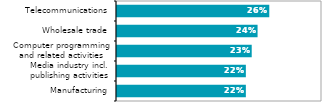
| Category | Series 0 |
|---|---|
| Manufacturing | 0.22 |
| Media industry incl. publishing activities | 0.22 |
| Computer programming and related activities | 0.23 |
| Wholesale trade | 0.24 |
| Telecommunications | 0.26 |